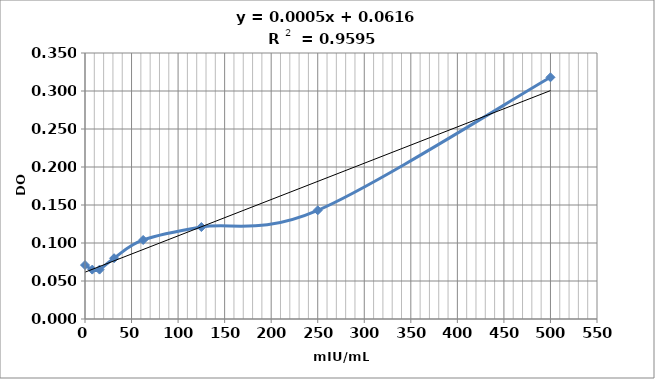
| Category | DO |
|---|---|
| 500.0 | 0.318 |
| 250.0 | 0.143 |
| 125.0 | 0.121 |
| 62.5 | 0.104 |
| 31.25 | 0.08 |
| 15.625 | 0.065 |
| 7.8125 | 0.065 |
| 0.0 | 0.071 |